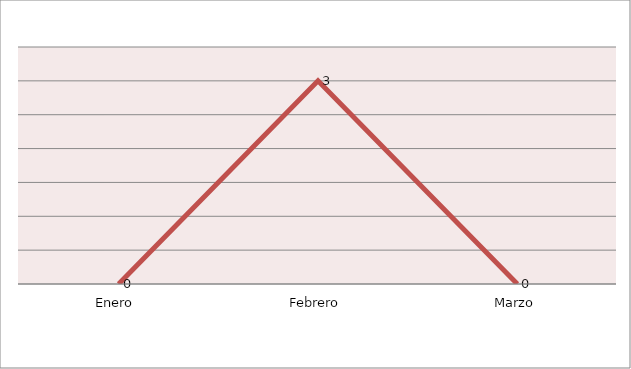
| Category | Series 0 |
|---|---|
| Enero  | 0 |
| Febrero | 3 |
| Marzo | 0 |